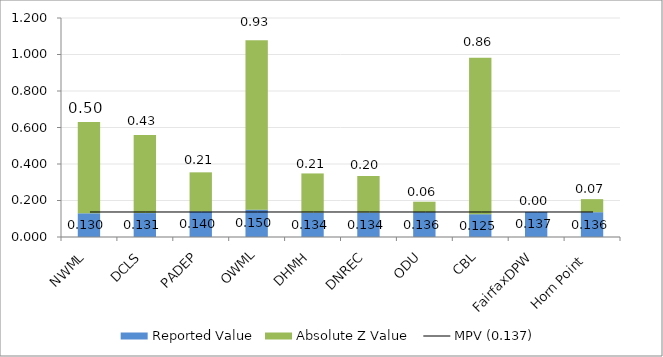
| Category | Reported Value | Absolute Z Value  |
|---|---|---|
| NWML | 0.13 | 0.5 |
| DCLS | 0.131 | 0.429 |
| PADEP | 0.14 | 0.214 |
| OWML | 0.15 | 0.929 |
| DHMH | 0.134 | 0.214 |
| DNREC | 0.134 | 0.2 |
| ODU | 0.136 | 0.057 |
| CBL | 0.125 | 0.857 |
| FairfaxDPW | 0.137 | 0 |
| Horn Point  | 0.136 | 0.071 |